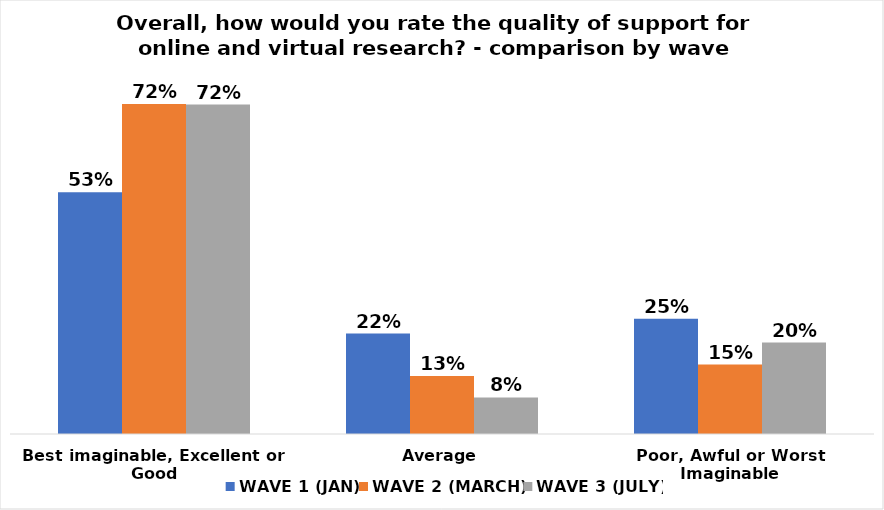
| Category | WAVE 1 (JAN) | WAVE 2 (MARCH) | WAVE 3 (JULY) |
|---|---|---|---|
| Best imaginable, Excellent or Good | 0.528 | 0.722 | 0.72 |
| Average | 0.22 | 0.127 | 0.08 |
| Poor, Awful or Worst Imaginable | 0.252 | 0.152 | 0.2 |